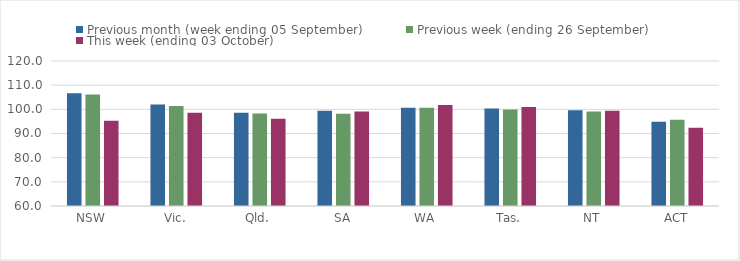
| Category | Previous month (week ending 05 September) | Previous week (ending 26 September) | This week (ending 03 October) |
|---|---|---|---|
| NSW | 106.65 | 106.09 | 95.32 |
| Vic. | 102.05 | 101.37 | 98.58 |
| Qld. | 98.62 | 98.24 | 96.09 |
| SA | 99.42 | 98.13 | 99.1 |
| WA | 100.62 | 100.64 | 101.79 |
| Tas. | 100.36 | 99.89 | 100.93 |
| NT | 99.63 | 99.07 | 99.45 |
| ACT | 94.84 | 95.68 | 92.33 |